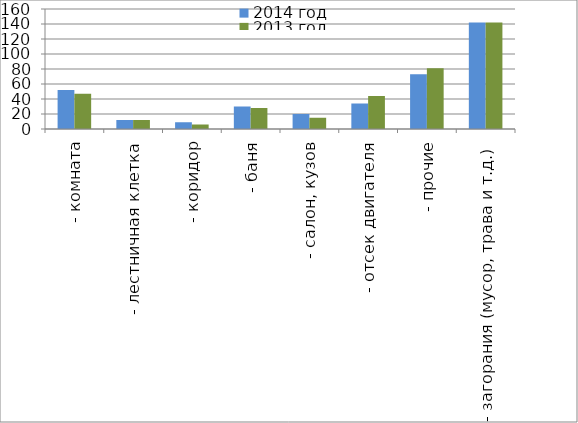
| Category | 2014 год | 2013 год |
|---|---|---|
|  - комната | 52 | 47 |
|  - лестничная клетка | 12 | 12 |
|  - коридор | 9 | 6 |
|  - баня | 30 | 28 |
|  - салон, кузов | 20 | 15 |
|  - отсек двигателя | 34 | 44 |
| - прочие | 73 | 81 |
| - загорания (мусор, трава и т.д.)  | 142 | 142 |